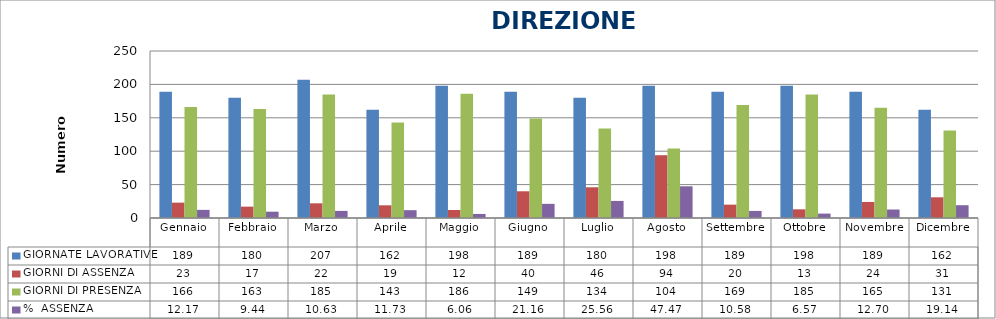
| Category | GIORNATE LAVORATIVE | GIORNI DI ASSENZA | GIORNI DI PRESENZA | %  ASSENZA |
|---|---|---|---|---|
| Gennaio | 189 | 23 | 166 | 12.169 |
| Febbraio | 180 | 17 | 163 | 9.444 |
| Marzo | 207 | 22 | 185 | 10.628 |
| Aprile | 162 | 19 | 143 | 11.728 |
| Maggio | 198 | 12 | 186 | 6.061 |
| Giugno | 189 | 40 | 149 | 21.164 |
| Luglio | 180 | 46 | 134 | 25.556 |
| Agosto | 198 | 94 | 104 | 47.475 |
| Settembre | 189 | 20 | 169 | 10.582 |
| Ottobre | 198 | 13 | 185 | 6.566 |
| Novembre | 189 | 24 | 165 | 12.698 |
| Dicembre | 162 | 31 | 131 | 19.136 |